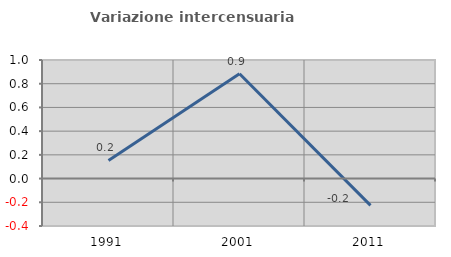
| Category | Variazione intercensuaria annua |
|---|---|
| 1991.0 | 0.153 |
| 2001.0 | 0.884 |
| 2011.0 | -0.226 |